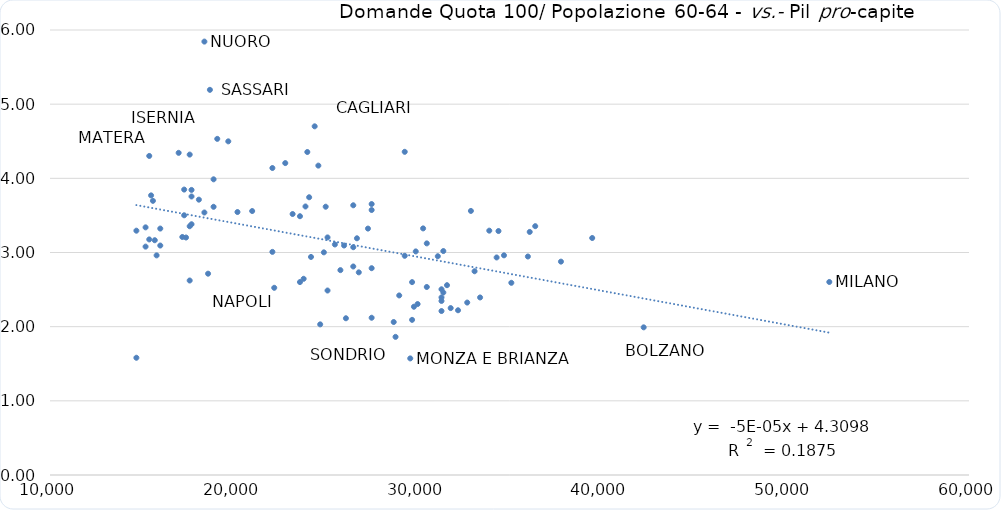
| Category | DOMANDE / POP 60-64 |
|---|---|
| 18400.0 | 5.844 |
| 18700.0 | 5.193 |
| 24400.0 | 4.701 |
| 19100.0 | 4.532 |
| 19700.0 | 4.499 |
| 29300.0 | 4.357 |
| 24000.0 | 4.355 |
| 17000.0 | 4.344 |
| 17600.0 | 4.32 |
| 15400.0 | 4.302 |
| 22800.0 | 4.206 |
| 24600.0 | 4.171 |
| 22100.0 | 4.139 |
| 18900.0 | 3.987 |
| 17300.0 | 3.848 |
| 17700.0 | 3.844 |
| 15500.0 | 3.77 |
| 17700.0 | 3.755 |
| 24100.0 | 3.745 |
| 18100.0 | 3.712 |
| 15600.0 | 3.697 |
| 27500.0 | 3.653 |
| 26500.0 | 3.637 |
| 23900.0 | 3.62 |
| 25000.0 | 3.617 |
| 18900.0 | 3.616 |
| 27500.0 | 3.573 |
| 32900.0 | 3.561 |
| 21000.0 | 3.559 |
| 20200.0 | 3.546 |
| 18400.0 | 3.539 |
| 23200.0 | 3.519 |
| 17300.0 | 3.502 |
| 23600.0 | 3.489 |
| 17700.0 | 3.381 |
| 36400.0 | 3.355 |
| 17600.0 | 3.354 |
| 15200.0 | 3.339 |
| 30300.0 | 3.325 |
| 16000.0 | 3.323 |
| 27300.0 | 3.323 |
| 33900.0 | 3.294 |
| 14700.0 | 3.294 |
| 34400.0 | 3.289 |
| 36100.0 | 3.277 |
| 17200.0 | 3.209 |
| 25100.0 | 3.203 |
| 17400.0 | 3.202 |
| 39500.0 | 3.195 |
| 26700.0 | 3.192 |
| 15400.0 | 3.176 |
| 15700.0 | 3.166 |
| 30500.0 | 3.123 |
| 25500.0 | 3.108 |
| 26000.0 | 3.094 |
| 16000.0 | 3.094 |
| 15200.0 | 3.079 |
| 26500.0 | 3.071 |
| 31400.0 | 3.02 |
| 29900.0 | 3.014 |
| 22100.0 | 3.008 |
| 24900.0 | 3.002 |
| 34700.0 | 2.962 |
| 15800.0 | 2.961 |
| 29300.0 | 2.955 |
| 31100.0 | 2.95 |
| 36000.0 | 2.946 |
| 24200.0 | 2.94 |
| 34300.0 | 2.933 |
| 37800.0 | 2.877 |
| 26500.0 | 2.811 |
| 27500.0 | 2.788 |
| 25800.0 | 2.762 |
| 33100.0 | 2.747 |
| 26800.0 | 2.732 |
| 18600.0 | 2.714 |
| 23800.0 | 2.645 |
| 17600.0 | 2.622 |
| 52400.0 | 2.603 |
| 23600.0 | 2.601 |
| 29700.0 | 2.601 |
| 35100.0 | 2.591 |
| 31600.0 | 2.559 |
| 30500.0 | 2.535 |
| 22200.0 | 2.524 |
| 31300.0 | 2.504 |
| 25100.0 | 2.487 |
| 31400.0 | 2.46 |
| 29000.0 | 2.421 |
| 31300.0 | 2.394 |
| 33400.0 | 2.394 |
| 31300.0 | 2.347 |
| 32700.0 | 2.325 |
| 30000.0 | 2.305 |
| 29800.0 | 2.269 |
| 31800.0 | 2.251 |
| 32200.0 | 2.221 |
| 31300.0 | 2.211 |
| 27500.0 | 2.12 |
| 26100.0 | 2.113 |
| 29700.0 | 2.092 |
| 28700.0 | 2.063 |
| 24700.0 | 2.031 |
| 42300.0 | 1.991 |
| 28800.0 | 1.863 |
| 14700.0 | 1.581 |
| 29600.0 | 1.572 |